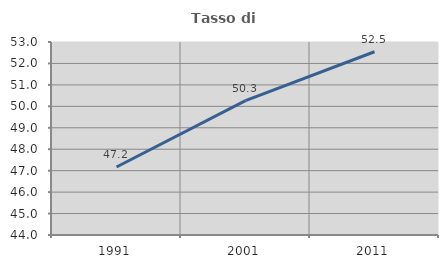
| Category | Tasso di occupazione   |
|---|---|
| 1991.0 | 47.172 |
| 2001.0 | 50.263 |
| 2011.0 | 52.544 |